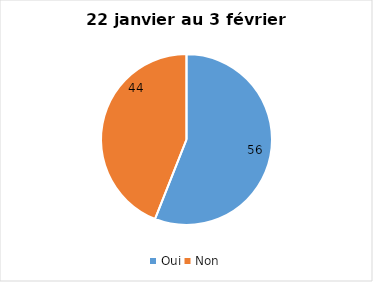
| Category | Series 0 |
|---|---|
| Oui | 56 |
| Non | 44 |